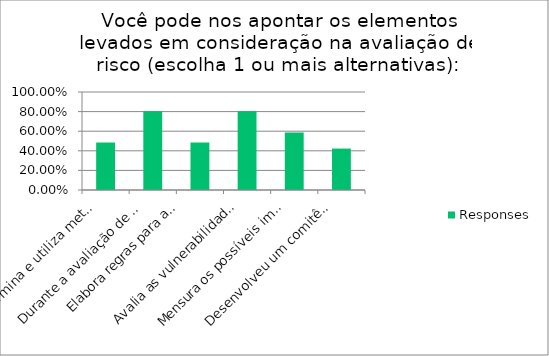
| Category | Responses |
|---|---|
| Determina e utiliza metodologia desenvolvida internamente ou 
por terceiros para a realização de avaliações de risco cibernético | 0.484 |
| Durante a avaliação de risco inicial, identifica todos os ativos relevantes da instituição 
(equipamentos, sistemas, dados ou processos) usados para seu correto funcionamento. | 0.804 |
| Elabora regras para a classificação das informações geradas pela instituição, 
permitindo com isso a implementação de processos para o devido manuseio, 
armazenamento, transporte e descarte dessas informações. | 0.484 |
| Avalia as vulnerabilidades dos ativos em questão, 
identificando as possíveis ameaças e o grau de exposição dos ativos a elas. | 0.804 |
| Mensura os possíveis impactos financeiros, operacionais e reputacionais, 
em caso de evento de segurança, bem como a expectativa de tais eventos. | 0.588 |
| Desenvolveu um comitê, fórum ou grupo específico para tratar 
segurança cibernética dentro da instituição, com representação e governança apropriados. | 0.423 |